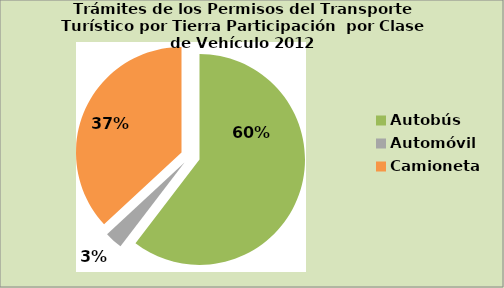
| Category | Series 0 |
|---|---|
| Autobús | 60.38 |
| Automóvil | 2.735 |
| Camioneta | 36.886 |